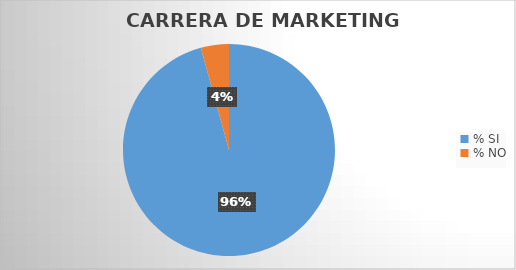
| Category | Series 0 |
|---|---|
| % SI | 95.714 |
| % NO | 4.286 |